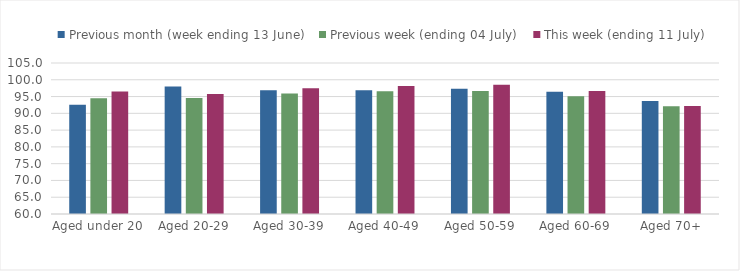
| Category | Previous month (week ending 13 June) | Previous week (ending 04 July) | This week (ending 11 July) |
|---|---|---|---|
| Aged under 20 | 92.567 | 94.523 | 96.493 |
| Aged 20-29 | 97.999 | 94.575 | 95.745 |
| Aged 30-39 | 96.909 | 95.895 | 97.465 |
| Aged 40-49 | 96.901 | 96.551 | 98.174 |
| Aged 50-59 | 97.363 | 96.674 | 98.534 |
| Aged 60-69 | 96.418 | 95.072 | 96.688 |
| Aged 70+ | 93.696 | 92.12 | 92.209 |